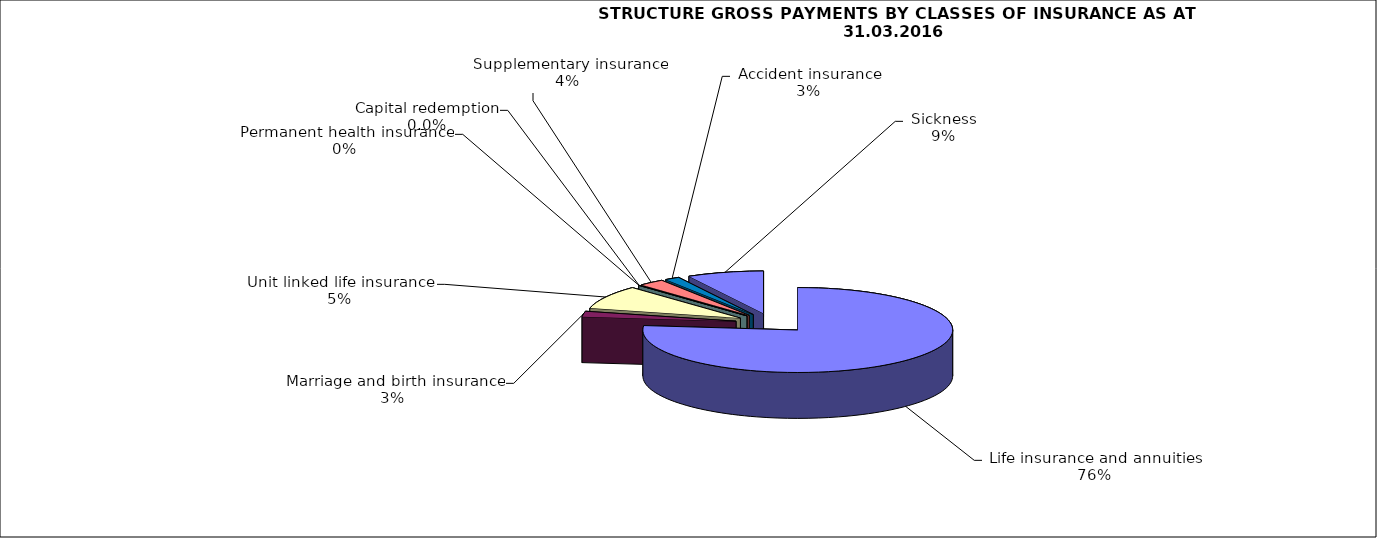
| Category | Series 0 |
|---|---|
| Life insurance and annuities | 29003714.942 |
| Marriage and birth insurance | 789424.688 |
| Unit linked life insurance | 3385521.89 |
| Permanent health insurance | 14534.62 |
| Capital redemption | 0 |
| Supplementary insurance | 1016107.085 |
| Accident insurance | 587405.29 |
| Sickness | 3026673.44 |